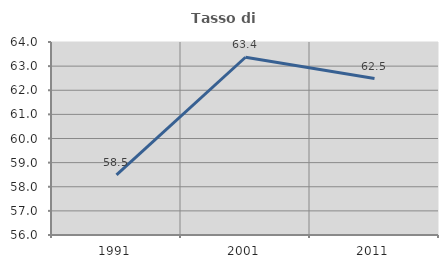
| Category | Tasso di occupazione   |
|---|---|
| 1991.0 | 58.488 |
| 2001.0 | 63.368 |
| 2011.0 | 62.486 |